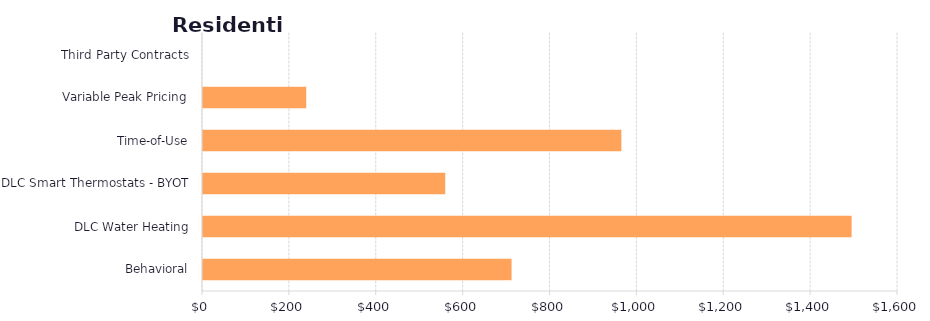
| Category | Series 1 |
|---|---|
| Behavioral | 710.367 |
| DLC Water Heating | 1493.239 |
| DLC Smart Thermostats - BYOT | 557.695 |
| Time-of-Use | 963.179 |
| Variable Peak Pricing | 237.636 |
| Third Party Contracts | 0 |